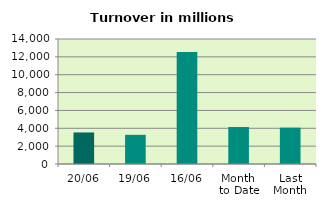
| Category | Series 0 |
|---|---|
| 20/06 | 3533.281 |
| 19/06 | 3269.44 |
| 16/06 | 12545.214 |
| Month 
to Date | 4139.588 |
| Last
Month | 4067.502 |